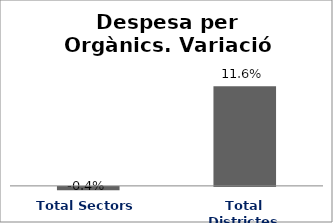
| Category | Series 0 |
|---|---|
| Total Sectors | -0.004 |
| Total Districtes | 0.116 |